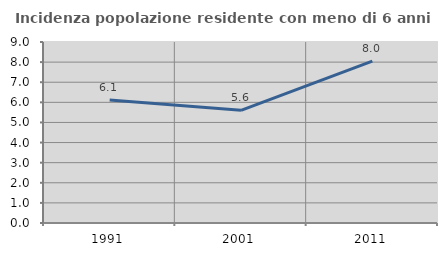
| Category | Incidenza popolazione residente con meno di 6 anni |
|---|---|
| 1991.0 | 6.113 |
| 2001.0 | 5.605 |
| 2011.0 | 8.047 |